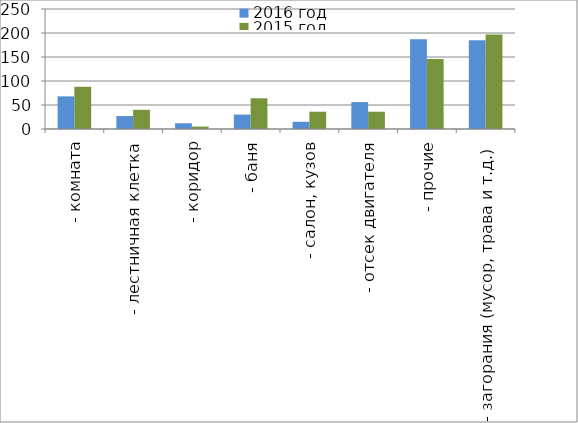
| Category | 2016 год | 2015 год |
|---|---|---|
|  - комната | 68 | 88 |
|  - лестничная клетка | 27 | 40 |
|  - коридор | 12 | 5 |
|  - баня | 30 | 64 |
|  - салон, кузов | 15 | 36 |
|  - отсек двигателя | 56 | 36 |
| - прочие | 187 | 146 |
| - загорания (мусор, трава и т.д.)  | 185 | 197 |